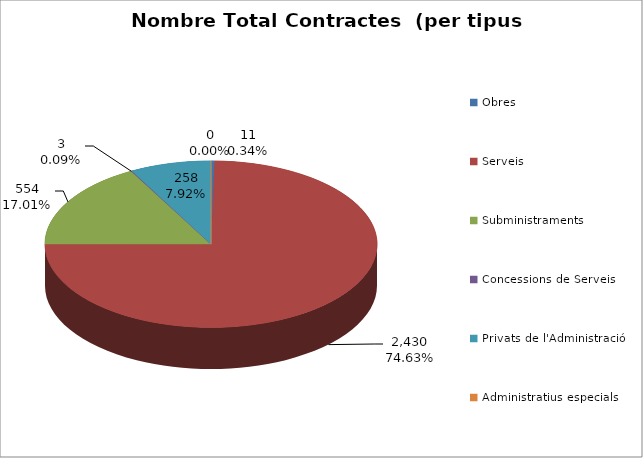
| Category | Nombre Total Contractes |
|---|---|
| Obres | 11 |
| Serveis | 2430 |
| Subministraments | 554 |
| Concessions de Serveis | 3 |
| Privats de l'Administració | 258 |
| Administratius especials | 0 |